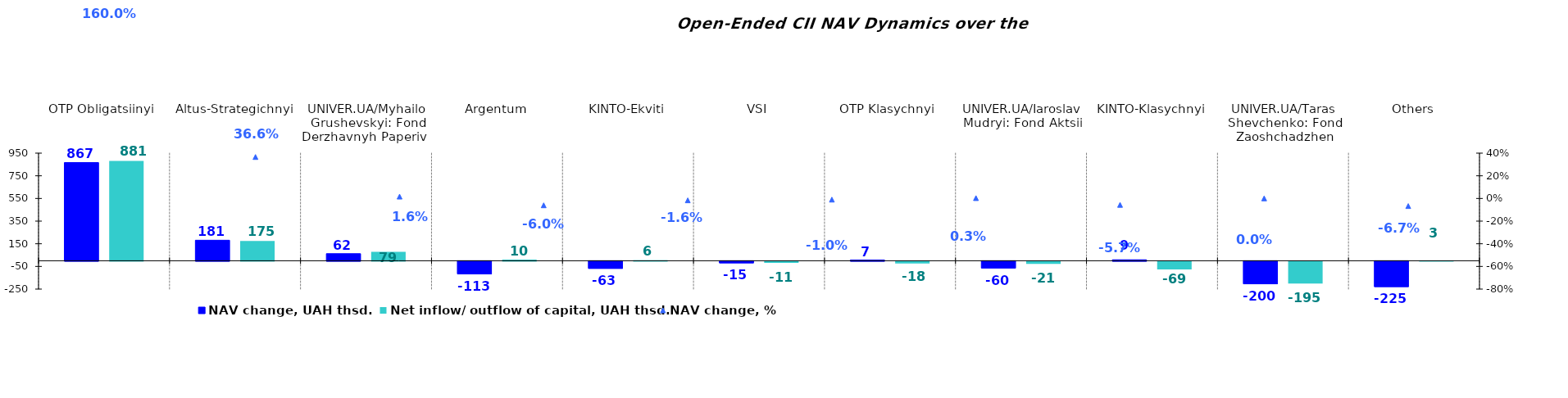
| Category | NAV change, UAH thsd. | Net inflow/ outflow of capital, UAH thsd. |
|---|---|---|
| OTP Obligatsiinyi  | 866.894 | 880.647 |
| Altus-Strategichnyi | 181.164 | 174.551 |
| UNIVER.UA/Myhailo Grushevskyi: Fond Derzhavnyh Paperiv    | 62.436 | 78.677 |
| Argentum | -112.866 | 9.883 |
| KINTO-Ekviti | -62.96 | 5.658 |
| VSI | -14.926 | -10.947 |
| OTP Klasychnyi  | 6.613 | -17.742 |
| UNIVER.UA/Iaroslav Mudryi: Fond Aktsii | -60.07 | -20.797 |
| KINTO-Klasychnyi | 8.541 | -68.851 |
| UNIVER.UA/Taras Shevchenko: Fond Zaoshchadzhen | -199.959 | -194.707 |
| Others | -224.651 | 3.399 |